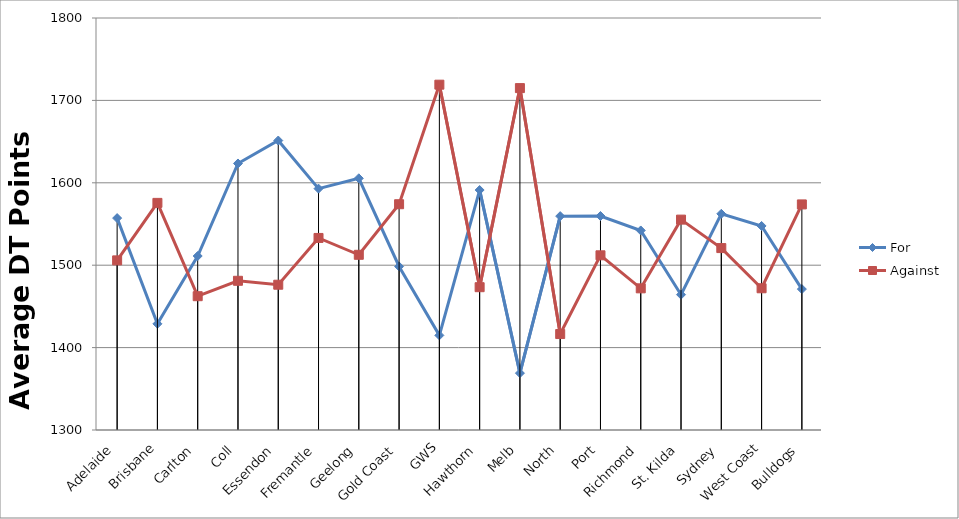
| Category | For | Against |
|---|---|---|
| Adelaide | 1557.15 | 1505.85 |
| Brisbane | 1428.85 | 1575.62 |
| Carlton | 1511.15 | 1462.38 |
| Coll | 1623.46 | 1481.08 |
| Essendon | 1651.31 | 1476.31 |
| Fremantle | 1592.92 | 1533.08 |
| Geelong | 1605.46 | 1512.62 |
| Gold Coast | 1498.46 | 1574 |
| GWS | 1414.85 | 1719.08 |
| Hawthorn | 1591.23 | 1473.31 |
| Melb | 1369 | 1714.92 |
| North | 1559.54 | 1416.46 |
| Port | 1559.69 | 1512 |
| Richmond | 1542.15 | 1471.92 |
| St. Kilda | 1464.23 | 1555.31 |
| Sydney | 1562.38 | 1520.77 |
| West Coast | 1547.62 | 1472 |
| Bulldogs | 1471 | 1573.77 |